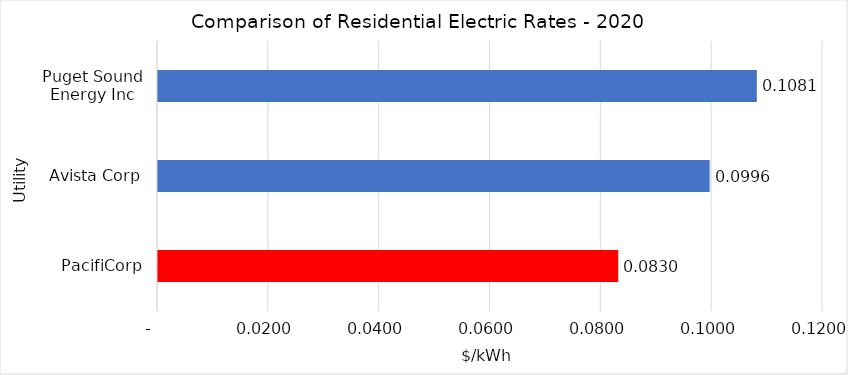
| Category | Series 0 |
|---|---|
| PacifiCorp | 0.083 |
| Avista Corp | 0.1 |
| Puget Sound Energy Inc | 0.108 |